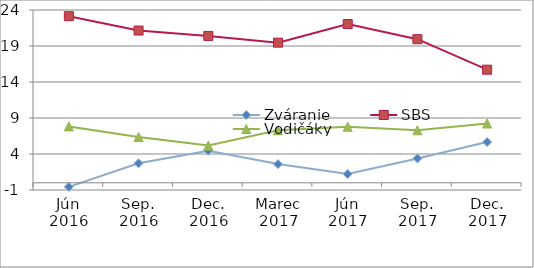
| Category | Zváranie | SBS | Vodičáky |
|---|---|---|---|
| Jún 2016 | -0.572 | 23.145 | 7.835 |
| Sep. 2016 | 2.705 | 21.146 | 6.359 |
| Dec. 2016 | 4.463 | 20.396 | 5.167 |
| Marec 2017 | 2.6 | 19.466 | 7.296 |
| Jún 2017 | 1.221 | 22.051 | 7.787 |
| Sep. 2017 | 3.385 | 19.946 | 7.297 |
| Dec. 2017 | 5.658 | 15.71 | 8.235 |